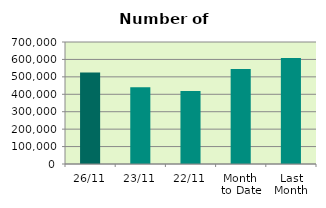
| Category | Series 0 |
|---|---|
| 26/11 | 524368 |
| 23/11 | 440606 |
| 22/11 | 419186 |
| Month 
to Date | 544715.667 |
| Last
Month | 607838.609 |